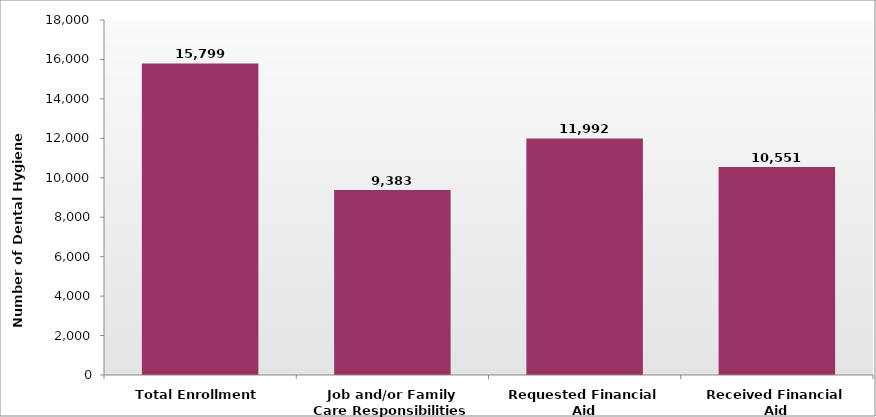
| Category | Number of Dental Hygiene Students |
|---|---|
| Total Enrollment | 15799 |
| Job and/or Family Care Responsibilities | 9383 |
| Requested Financial Aid | 11992 |
| Received Financial Aid | 10551 |